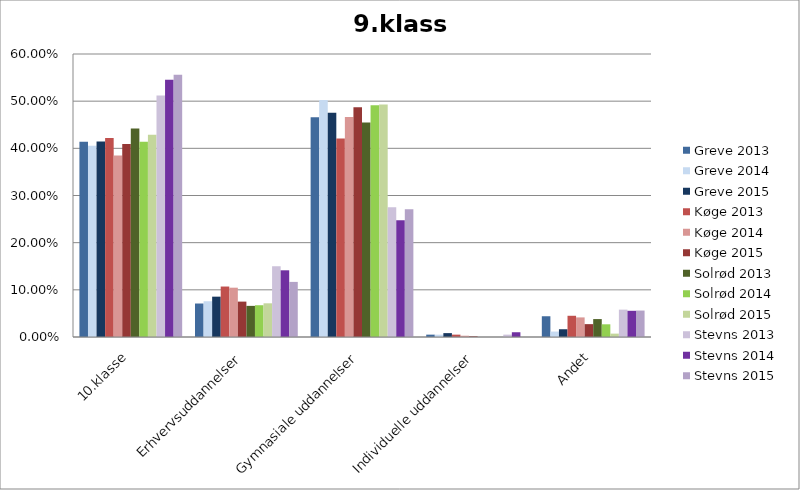
| Category | Greve 2013 | Greve 2014 | Greve 2015 | Køge 2013 | Køge 2014 | Køge 2015 | Solrød 2013 | Solrød 2014 | Solrød 2015 | Stevns 2013 | Stevns 2014 | Stevns 2015 |
|---|---|---|---|---|---|---|---|---|---|---|---|---|
| 10.klasse | 0.414 | 0.405 | 0.414 | 0.422 | 0.385 | 0.409 | 0.442 | 0.414 | 0.429 | 0.512 | 0.545 | 0.556 |
| Erhvervsuddannelser | 0.071 | 0.076 | 0.086 | 0.107 | 0.105 | 0.075 | 0.066 | 0.067 | 0.071 | 0.15 | 0.141 | 0.117 |
| Gymnasiale uddannelser | 0.466 | 0.502 | 0.475 | 0.421 | 0.466 | 0.487 | 0.455 | 0.492 | 0.493 | 0.275 | 0.247 | 0.271 |
| Individuelle uddannelser | 0.005 | 0.005 | 0.008 | 0.005 | 0.003 | 0.001 | 0 | 0 | 0 | 0.005 | 0.01 | 0 |
| Andet | 0.044 | 0.012 | 0.016 | 0.045 | 0.042 | 0.027 | 0.038 | 0.027 | 0.007 | 0.058 | 0.056 | 0.056 |